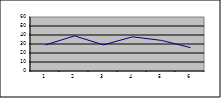
| Category | Series 0 |
|---|---|
| 0 | 29 |
| 1 | 39 |
| 2 | 29 |
| 3 | 38 |
| 4 | 34 |
| 5 | 26 |